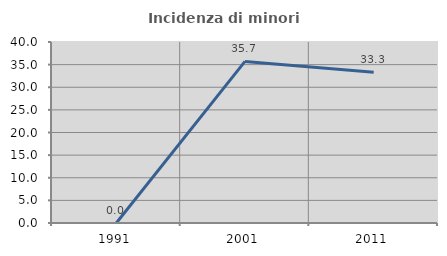
| Category | Incidenza di minori stranieri |
|---|---|
| 1991.0 | 0 |
| 2001.0 | 35.714 |
| 2011.0 | 33.333 |